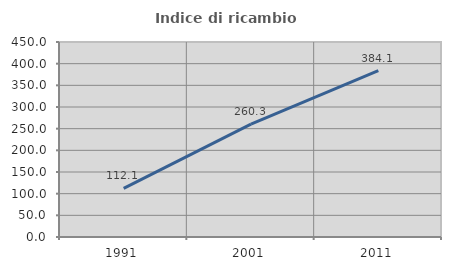
| Category | Indice di ricambio occupazionale  |
|---|---|
| 1991.0 | 112.146 |
| 2001.0 | 260.305 |
| 2011.0 | 384.127 |